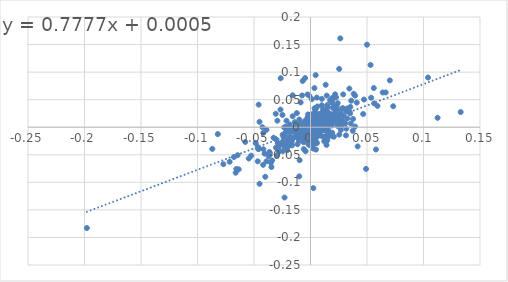
| Category | SPY |
|---|---|
| -0.007057278844575738 | -0.003 |
| 0.03949500980977561 | 0.001 |
| -0.029311915210731076 | 0.012 |
| 0.009613776960374448 | 0.019 |
| 0.07321012022250145 | 0.038 |
| -0.04629075040643459 | -0.039 |
| -0.03691800576843832 | -0.053 |
| 0.009399434370321041 | 0.025 |
| -0.0242675107539972 | -0.027 |
| 0.03738317757009344 | -0.007 |
| 0.011411053393510935 | -0.004 |
| 0.059263936496482116 | 0.039 |
| 0.022599391200073822 | 0.054 |
| -0.003401360544217729 | -0.007 |
| -0.06562446315066141 | -0.076 |
| 0.053670015386007845 | 0.053 |
| -0.016380308021009555 | -0.002 |
| -0.0009782995375311227 | 0.021 |
| 0.04731743666169894 | 0.05 |
| -0.046451727506883415 | -0.036 |
| -0.01625163826998689 | -0.022 |
| -0.07155025553662686 | -0.063 |
| -0.03898027598035405 | -0.005 |
| 0.02190885914595295 | 0.028 |
| -0.020140515222482423 | -0.005 |
| 0.003603885929175758 | 0.034 |
| 0.056010589889964386 | 0.071 |
| -0.0018992568125515258 | 0.001 |
| 0.0006610477607006966 | 0.023 |
| -0.021665319320937806 | -0.008 |
| -0.023138276869620094 | -0.034 |
| -0.0007102272727272996 | 0.011 |
| -0.003225045229292823 | -0.015 |
| -0.0011785040854808743 | -0.032 |
| -0.0163833075734158 | -0.002 |
| 0.01986128625472896 | 0.016 |
| 0.013175756607841503 | 0.006 |
| -0.006189984921831609 | -0.027 |
| -0.0021381057966423506 | 0.023 |
| 0.014052838673412029 | -0.005 |
| 0.027729636048526858 | 0.033 |
| -0.019342829394626098 | -0.034 |
| -0.01231015187849714 | -0.01 |
| 0.0011203585147247165 | -0.023 |
| -0.016372795969773396 | -0.019 |
| 0.010660302307080377 | -0.001 |
| 0.014937424303593126 | -0.019 |
| 0.02686344415885909 | 0.001 |
| -0.005032172908760926 | -0.01 |
| -0.00720720720720717 | -0.01 |
| 0.016991504247875995 | -0.011 |
| 0.01103157894736844 | 0.025 |
| 0.0011803389258915823 | -0.014 |
| 0.010478786846140774 | 0.014 |
| 0.0037626133059688537 | 0.021 |
| 0.012993762993762994 | 0.012 |
| 0.03440860215053767 | 0.07 |
| -0.012389380530973501 | -0.017 |
| 0.0007084661707403321 | -0.016 |
| -0.02047189451769604 | -0.021 |
| 0.03566615757793548 | 0.007 |
| 0.001169275049469288 | 0.051 |
| 0.005516867142986467 | -0.006 |
| 0.009956156375593616 | 0.04 |
| 0.016905071521456507 | 0.008 |
| -0.0018542555164101876 | -0.016 |
| 0.02072489826819341 | -0.017 |
| 0.014399539214745127 | 0.057 |
| 0.005404883698484724 | -0.018 |
| 0.03765648472709069 | 0.015 |
| -0.006269904458598822 | -0.012 |
| -0.007114624505928842 | -0.002 |
| -0.036374023995429376 | -0.045 |
| 0.01921583850931667 | -0.01 |
| -0.0012600562178927543 | 0 |
| 0.035219747140276994 | 0.037 |
| -0.012093576526566207 | 0.026 |
| 0.056335078534031365 | 0.043 |
| -0.05248536561166788 | -0.052 |
| -0.034578544061302674 | -0.072 |
| 0.023529411764705938 | 0.031 |
| 0.026776726394201696 | -0.005 |
| -0.02330154360436526 | 0 |
| 0.002365231102788951 | -0.039 |
| -0.04192238693230099 | -0.068 |
| 0.023581714506620256 | 0.026 |
| -0.0635351615530817 | -0.076 |
| -0.02462923728813565 | -0.013 |
| 0.02054054054054055 | 0.009 |
| -0.001618996222342209 | 0.011 |
| 0.014879050661798354 | 0.04 |
| 0.010422431285740595 | -0.017 |
| 0.005285118219749721 | 0.002 |
| 0.008603759468811254 | 0.011 |
| 0.010585010868537989 | 0.024 |
| 0.031688767550702025 | -0.003 |
| -0.0035946759933936125 | -0.003 |
| 0.028682790325804564 | 0.035 |
| 0.012958088681919428 | -0.003 |
| -0.006836919364568597 | -0.006 |
| -0.016707859614434127 | -0.027 |
| -0.03895486935866978 | -0.062 |
| -0.00810479690886815 | 0.006 |
| 0.02809805251429131 | 0.006 |
| -0.009215705097436959 | -0.017 |
| 0.02057411580288046 | 0.021 |
| -0.002735710796287261 | 0.017 |
| 0.000880109524740751 | -0.004 |
| 0.013077075490390404 | 0.026 |
| 0.0012895546076777647 | -0.013 |
| -0.0016835016835017003 | 0.004 |
| 0.023203972033640757 | 0.039 |
| 0.03448637316561836 | 0.028 |
| -0.04178384893531535 | -0.01 |
| -0.007476821852258 | 0.058 |
| 0.015180649731808521 | 0.037 |
| 0.04660523249655763 | 0.024 |
| -0.01881105799210146 | -0.023 |
| -0.021259281863493067 | 0.012 |
| 0.023422860712054964 | 0.016 |
| 0.02661109329913444 | 0.009 |
| -0.012766406414855538 | -0.002 |
| 0.0039190763690287525 | 0.011 |
| 0.021642679363705227 | 0.036 |
| -0.0039879284328519565 | 0.006 |
| 0.024174853736615494 | 0.002 |
| 0.007675194660734123 | 0.003 |
| 0.04171494785631528 | -0.035 |
| 0.07018849206349202 | 0.085 |
| -0.0206461015302405 | -0.042 |
| -0.022090261282660326 | 0.001 |
| -0.0021332069210712565 | -0.03 |
| -0.02653437932625763 | 0.032 |
| 0.005568445475638097 | 0.054 |
| 0.021811284969179747 | 0.06 |
| 0.039428289797930054 | 0.057 |
| 0.003461918892185969 | -0.017 |
| -0.04588887578152649 | 0.041 |
| 0.05790590290777488 | -0.04 |
| 0.014175420832805851 | -0.032 |
| -0.004786497039929405 | 0.089 |
| 0.014828071072478544 | -0.024 |
| 0.018354595157511207 | 0.049 |
| 0.03252688172042994 | 0.034 |
| 0.06392106392106389 | 0.063 |
| 0.015243902439024556 | 0.024 |
| 0.10402308062189446 | 0.09 |
| -0.06769276748356248 | -0.054 |
| -0.0450913242009132 | -0.103 |
| -0.06447737284741688 | -0.051 |
| -0.04852025911342572 | -0.029 |
| 0.050013336889837286 | 0.15 |
| -0.0033231423634188487 | -0.006 |
| -0.022987012987012934 | -0.128 |
| -0.045138888888888895 | 0.01 |
| -0.041711229946524125 | -0.04 |
| 0.06653992395437262 | 0.063 |
| -0.01164975573092813 | 0 |
| -0.0010011262670504104 | -0.012 |
| 0.012159594680177247 | -0.026 |
| -0.02398318704413398 | -0.017 |
| 0.13291316526610636 | 0.028 |
| -0.08202622782206216 | -0.012 |
| -0.07712387280493593 | -0.067 |
| -0.03059581320450882 | -0.037 |
| 0.11247600767754308 | 0.017 |
| -0.06619667821723016 | -0.083 |
| 0.053101799421165205 | 0.113 |
| -0.197920872022608 | -0.183 |
| -0.08690443277117323 | -0.039 |
| -0.026379542395693116 | 0.089 |
| -0.00994936483965524 | -0.089 |
| 0.013413755851638414 | 0.077 |
| -0.033918942424769574 | -0.06 |
| -0.006566442025228883 | -0.02 |
| -0.004044402375010747 | 0.005 |
| 0.006234306000519516 | -0.011 |
| 0.025392879339429988 | 0.106 |
| 0.005445456168541327 | -0.027 |
| -0.004001066951187009 | 0.011 |
| 0.017275687409551342 | 0.024 |
| -0.019510464703795697 | -0.028 |
| -0.00957400087834861 | -0.06 |
| -0.030816378649868092 | -0.021 |
| -0.02869191334546055 | -0.029 |
| -0.0010737589824068347 | 0.057 |
| -0.02887623325579537 | -0.029 |
| 0.019628690602764422 | 0.01 |
| -0.03511679292929295 | -0.065 |
| 0.027070838061274142 | 0.024 |
| -0.018456642800318276 | 0.005 |
| 0.013627933231191014 | -0.02 |
| 0.008129420372327452 | -0.006 |
| 0.038234301147873066 | 0.061 |
| -0.025657894736842025 | -0.03 |
| 0.040917651087142626 | 0.045 |
| -0.004346714395295365 | -0.044 |
| 0.024090075936108974 | 0.044 |
| -0.000697775839511666 | 0.003 |
| -0.03077183193845634 | 0.024 |
| -0.013263263263263174 | -0.017 |
| 0.003599832565927104 | -0.023 |
| 0.015558578473048786 | -0.005 |
| -0.0466850380936942 | -0.062 |
| 0.04914965986394559 | -0.076 |
| 0.0074530968902594905 | -0.002 |
| -0.05771714562479813 | -0.027 |
| -0.00824593707469379 | -0.014 |
| -0.040629800307219605 | -0.048 |
| -0.00565144340919512 | 0.002 |
| 0.011901081916537805 | 0.021 |
| -0.024794634109578658 | 0.022 |
| 0.0151480376405783 | 0.028 |
| 0.03140534995660068 | -0.015 |
| -0.011389343942585176 | 0.001 |
| 0.004466384579219504 | 0.014 |
| -0.04001805325710842 | -0.09 |
| -0.015769600947656736 | 0.058 |
| 0.02636778115501519 | 0.161 |
| -0.042560931247726405 | 0 |
| 0.003065022257899639 | 0.011 |
| 0.021392367322599914 | 0.013 |
| 0.0040413111809608744 | 0.029 |
| 0.025479662317728264 | -0.013 |
| 0.01932253774544327 | 0.021 |
| -0.010297305667389272 | -0.01 |
| -0.004930662557781316 | -0.003 |
| 0.024952621604548413 | 0.02 |
| 0.0 | -0.012 |
| 0.006357279084551789 | -0.008 |
| -0.009055831167808422 | -0.015 |
| -0.054641554381002135 | -0.057 |
| -0.0087078444395246 | 0.045 |
| 0.012250690968850274 | -0.005 |
| 0.016940139775144473 | 0.017 |
| -0.0008349146110057962 | 0 |
| -0.01642403882045531 | -0.033 |
| 0.01777980396626377 | 0.015 |
| -0.019737822136153563 | -0.017 |
| 0.01573611741564521 | 0.003 |
| -0.006090683510038365 | -0.011 |
| 0.011715481171548274 | 0.001 |
| -0.0003802281368822157 | 0.011 |
| 0.009286975209148883 | 0.015 |
| 0.006100386100386039 | 0.038 |
| 0.02274522192386665 | 0.015 |
| 0.007479312539783559 | 0.002 |
| 0.015760122848137097 | 0.025 |
| -0.009684648631342994 | -0.005 |
| 0.03504266423660015 | 0.025 |
| -0.012031429039122712 | 0.002 |
| 0.01520565018695482 | -0.017 |
| -0.0456744112282928 | -0.039 |
| -0.0029253636938646787 | 0.006 |
| 0.012406947890818835 | -0.005 |
| -0.005967536600891152 | -0.04 |
| 0.0188067444876784 | -0.014 |
| -0.004759983864461504 | -0.016 |
| -0.002976190476190399 | -0.003 |
| 0.019183472700442607 | 0.053 |
| -0.007566512082011168 | -0.007 |
| 0.006139489194499018 | 0.007 |
| -0.011170471102477009 | -0.018 |
| 0.012125184335572702 | 0.027 |
| 0.00859362088910929 | 0.01 |
| -0.00099058940069345 | -0.022 |
| -0.0004950495049505138 | 0.012 |
| 0.01584108624591401 | 0.009 |
| 0.012388629613916064 | 0.017 |
| -0.009913467193144643 | 0.014 |
| 0.007789348912031172 | -0.003 |
| 0.001526329178326063 | 0.002 |
| 0.012014073629108432 | 0.018 |
| 0.010755486165322186 | 0.019 |
| 0.016039481801357253 | 0.026 |
| -0.0036877688998156266 | -0.007 |
| 0.017329164805716817 | 0.049 |
| -0.008677942088019162 | -0.009 |
| 0.012371134020618643 | 0 |
| -0.0066785396260017815 | 0.002 |
| 0.028953637529778236 | 0.06 |
| -0.009259259259259224 | 0.006 |
| 0.001636661211129229 | 0.002 |
| 0.03257910055393858 | 0.016 |
| 0.0034859619370642978 | 0.071 |
| -0.024448529411764675 | -0.043 |
| -0.0052116668190546524 | 0 |
| 0.02281866641728231 | 0.035 |
| -0.0016805153580430642 | 0.018 |
| -0.0012122342409548253 | 0.008 |
| -0.028271112722000766 | -0.037 |
| 0.004825639624874817 | -0.041 |
| 0.010023910244620227 | 0.051 |
| -0.016550601428959016 | -0.023 |
| -0.024783912506614943 | -0.026 |
| 0.00800142247510661 | -0.015 |
| 0.0024955436720142704 | -0.111 |
| 0.018888485288775864 | 0.003 |
| -0.006406207705494845 | -0.006 |
| -0.0021607994958134052 | 0.001 |
| -0.002962298025134762 | 0.007 |
| -0.0031319910514540877 | -0.018 |
| 0.019802883737908394 | 0.012 |
| -0.001275975209624504 | 0.009 |
| -0.005077983315197699 | 0.011 |
| 0.0046460781634326785 | -0.003 |
| 0.01714232765011114 | 0.004 |
| 0.002973977695167355 | -0.031 |
| -0.017710425415373487 | -0.009 |
| 0.02040055891942256 | 0.052 |
| -0.020975832193342557 | -0.029 |
| 0.001827318410233009 | 0.01 |
| 0.031573986804901116 | 0.029 |
| -0.017774486206258117 | -0.019 |
| 0.003157503714710152 | -0.01 |
| 0.005603287261860371 | -0.029 |
| -0.004184878638519509 | -0.011 |
| -0.0021343726800297324 | 0.009 |
| 0.015932874516828625 | -0.011 |
| 0.011057096558955263 | 0.032 |
| 0.013525263259588362 | 0.023 |
| 0.0193008370260956 | 0.044 |
| 0.014181563966843122 | 0.031 |
| -0.004573019186797971 | 0.004 |
| -0.007890324489594607 | 0.003 |
| -0.027900287631831226 | -0.044 |
| 0.013211579560909263 | 0.018 |
| -0.016716018721940968 | -0.03 |
| -0.0045640391746696206 | -0.019 |
| 0.019089147286821692 | -0.016 |
| 0.012459531050721043 | 0.002 |
| -0.013930540775853706 | 0.009 |
| -0.00481370944449793 | -0.009 |
| 0.001446201311222577 | -0.026 |
| -0.00689391037916506 | 0.084 |
| 0.001534330648254666 | -0.003 |
| 0.005787037037036982 | -0.004 |
| 0.012500000000000011 | 0.028 |
| 0.014966795519873179 | 0.015 |
| 0.004580304689833652 | -0.013 |
| -0.01962124170245989 | 0 |
| 0.013755566551212278 | -0.015 |
| 0.0003960003960003172 | 0 |
| -0.0007913740231476733 | -0.025 |
| 0.009486718593968473 | 0.013 |
| 0.02939967105263157 | 0.021 |
| -0.011683429848623444 | 0.003 |
| 0.011509608467783419 | -0.003 |
| 0.0015438452037876255 | 0.013 |
| 0.012505210504376854 | 0.021 |
| -0.032661290322580736 | -0.019 |
| 0.004862236628849311 | 0.034 |
| 0.002437043054427243 | -0.006 |
| -0.011741093828399414 | -0.001 |
| -0.011506794960817345 | -0.031 |
| -0.01907171353507827 | -0.003 |
| 0.01071990558615253 | -0.003 |
| 0.00863009622061308 | -0.009 |
| -0.0031642440423216966 | -0.016 |
| 0.0044696066746125205 | -0.013 |
| 0.023899115224244975 | 0.005 |
| 0.005522037018099928 | 0.021 |
| -0.012321987678012309 | -0.018 |
| -0.0017140552530752339 | -0.021 |
| -0.020057306590257753 | -0.002 |
| 0.0007910610105804241 | -0.011 |
| 0.011097780443911213 | 0.002 |
| 0.005731523378582133 | -0.004 |
| 0.000603682463024472 | -0.006 |
| 0.0076034063260340635 | 0.024 |
| 0.007970570202329871 | -0.01 |
| -0.008611082970317034 | -0.001 |
| 0.01282577467679048 | 0.023 |
| 0.03603699372807485 | 0.048 |
| 0.029212253829321525 | 0.008 |
| -0.01146441704520861 | -0.009 |
| -0.011017221093165058 | 0 |
| -0.010059296908089823 | -0.009 |
| 0.019650183545670406 | 0.035 |
| -0.01499521429331061 | -0.008 |
| 0.005023514322359971 | 0.001 |
| 0.00840698426384998 | 0.014 |
| 0.005963352488344326 | -0.013 |
| 0.008749863283386165 | 0.012 |
| 0.030777903043968477 | 0.007 |
| 0.003166704365528174 | -0.004 |
| -0.03597906672481462 | -0.047 |
| 0.017189752689364502 | 0.016 |
| -0.015826238812486387 | 0.02 |
| -0.009085009733938885 | -0.013 |
| -0.010170217321485953 | -0.025 |
| -0.00849166755121534 | 0 |
| 0.0019142826757417059 | 0.008 |
| -0.002651675859142978 | 0.059 |
| 0.012022327179046851 | 0.031 |
| 0.0010745755426605878 | -0.011 |
| 0.027833001988071523 | 0.013 |
| -0.002094125427091345 | 0.002 |
| 0.00066174037719204 | 0.003 |
| -0.008962728167012714 | -0.014 |
| -0.02969561989606545 | -0.051 |
| 0.004581291284892466 | 0.095 |
| -0.004665959703075268 | -0.013 |
| -0.0023275497249259296 | -0.014 |
| 0.0324412889131622 | 0.033 |